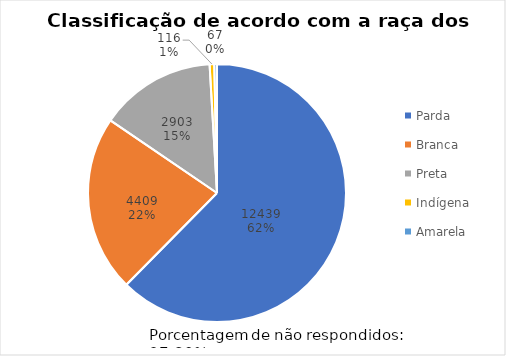
| Category | Series 0 |
|---|---|
| Parda | 12439 |
| Branca | 4409 |
| Preta | 2903 |
| Indígena | 116 |
| Amarela | 67 |